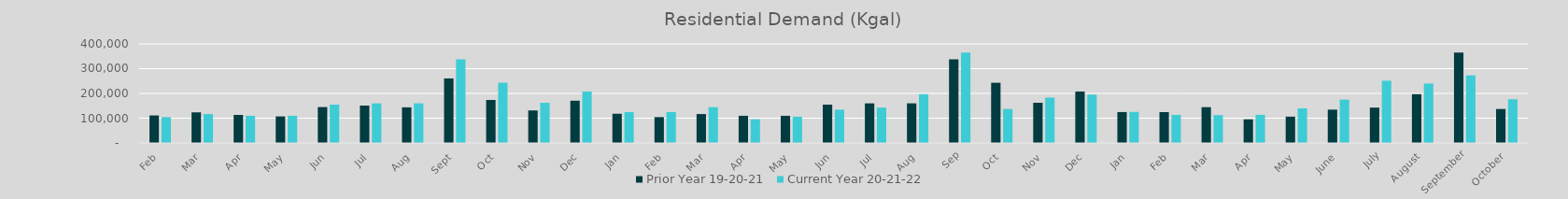
| Category | Prior Year 19-20-21 | Current Year 20-21-22 |
|---|---|---|
| Feb | 111009.962 | 104204.224 |
| Mar | 123525.131 | 116687.491 |
| Apr | 113258.787 | 109598.965 |
| May | 107128.051 | 109656.015 |
| Jun | 144930.453 | 154696.236 |
| Jul | 151028.014 | 159889.353 |
| Aug | 143816.337 | 160013.985 |
| Sep | 260607.456 | 337995.641 |
| Oct | 173601.368 | 243049.084 |
| Nov | 131198.833 | 162175.563 |
| Dec | 170629.384 | 207737.904 |
| Jan | 117899.625 | 124779.797 |
| Feb | 104204.224 | 124538.238 |
| Mar | 116687.491 | 144510.137 |
| Apr | 109598.965 | 95313.825 |
| May | 109656.015 | 106271.913 |
| Jun | 154696.236 | 134556.172 |
| Jul | 159889.353 | 142779.003 |
| Aug | 160013.985 | 196888.231 |
| Sep | 337995.641 | 364911.478 |
| Oct | 243049.084 | 137121.969 |
| Nov | 162175.563 | 182996.966 |
| Dec | 207737.904 | 195285.925 |
| Jan | 124779.797 | 125449.092 |
| Feb | 124538.238 | 113415.44 |
| Mar | 144510.137 | 112550.393 |
| Apr | 95313.825 | 113675.535 |
| May | 106271.913 | 139571.108 |
| June | 134556.172 | 175001.205 |
| July | 142779.003 | 251418.545 |
| August | 196888.231 | 239882.104 |
| September | 364911.478 | 272999.505 |
| October | 137121.969 | 176503.884 |